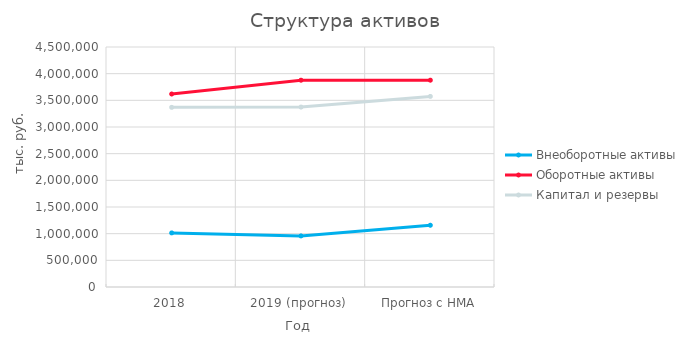
| Category | Внеоборотные активы | Оборотные активы | Капитал и резервы |
|---|---|---|---|
| 2018 | 1013965 | 3618722 | 3368386 |
| 2019 (прогноз) | 957567 | 3877421 | 3373772 |
| Прогноз с НМА | 1157567 | 3877421 | 3573772 |